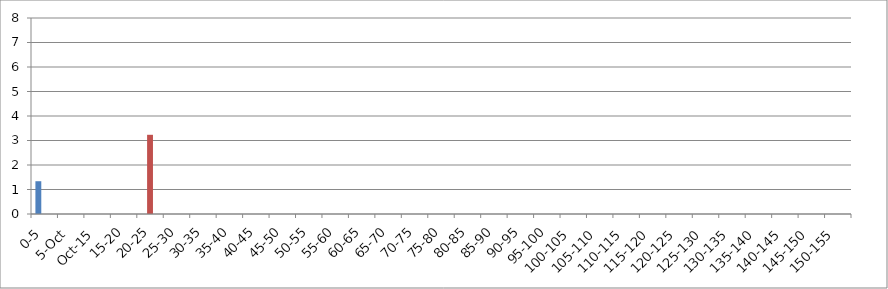
| Category | 119875 | 146067 | 241240 |
|---|---|---|---|
| 0-5 | 1.338 | 0 | 0 |
| 5.Oct | 0 | 0 | 0 |
| Oct.15 | 0 | 0 | 0 |
| 15-20 | 0 | 0 | 0 |
| 20-25 | 0 | 3.233 | 0 |
| 25-30 | 0 | 0 | 0 |
| 30-35 | 0 | 0 | 0 |
| 35-40 | 0 | 0 | 0 |
| 40-45 | 0 | 0 | 0 |
| 45-50 | 0 | 0 | 0 |
| 50-55 | 0 | 0 | 0 |
| 55-60 | 0 | 0 | 0 |
| 60-65 | 0 | 0 | 0 |
| 65-70 | 0 | 0 | 0 |
| 70-75 | 0 | 0 | 0 |
| 75-80 | 0 | 0 | 0 |
| 80-85 | 0 | 0 | 0 |
| 85-90 | 0 | 0 | 0 |
| 90-95 | 0 | 0 | 0 |
| 95-100 | 0 | 0 | 0 |
| 100-105 | 0 | 0 | 0 |
| 105-110 | 0 | 0 | 0 |
| 110-115 | 0 | 0 | 0 |
| 115-120 | 0 | 0 | 0 |
| 120-125 | 0 | 0 | 0 |
| 125-130 | 0 | 0 | 0 |
| 130-135 | 0 | 0 | 0 |
| 135-140 | 0 | 0 | 0 |
| 140-145 | 0 | 0 | 0 |
| 145-150 | 0 | 0 | 0 |
| 150-155 | 0 | 0 | 0 |